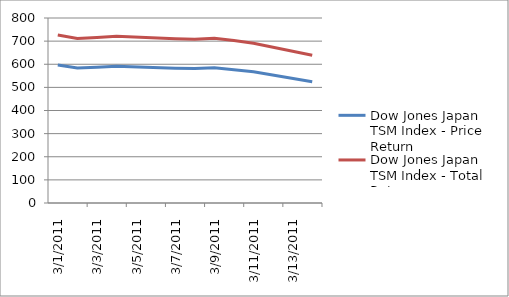
| Category | Dow Jones Japan TSM Index - Price Return | Dow Jones Japan TSM Index - Total Return |
|---|---|---|
| 01/03/2011 | 596.63 | 726.801 |
| 02/03/2011 | 583.837 | 711.217 |
| 03/03/2011 | 587.394 | 715.55 |
| 04/03/2011 | 591.733 | 720.836 |
| 07/03/2011 | 583.147 | 710.377 |
| 08/03/2011 | 581.636 | 708.536 |
| 09/03/2011 | 584.794 | 712.383 |
| 10/03/2011 | 576.622 | 702.428 |
| 11/03/2011 | 567.124 | 690.859 |
| 14/03/2011 | 524.316 | 638.712 |